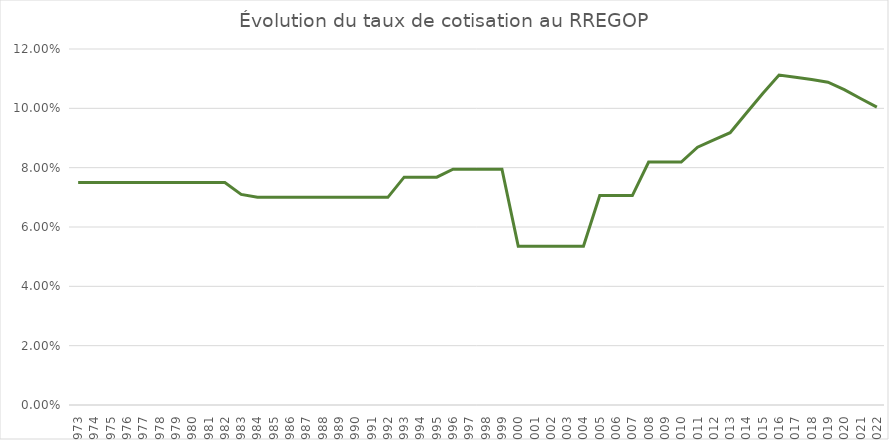
| Category | Series 0 |
|---|---|
| 1973.0 | 0.075 |
| 1974.0 | 0.075 |
| 1975.0 | 0.075 |
| 1976.0 | 0.075 |
| 1977.0 | 0.075 |
| 1978.0 | 0.075 |
| 1979.0 | 0.075 |
| 1980.0 | 0.075 |
| 1981.0 | 0.075 |
| 1982.0 | 0.075 |
| 1983.0 | 0.071 |
| 1984.0 | 0.07 |
| 1985.0 | 0.07 |
| 1986.0 | 0.07 |
| 1987.0 | 0.07 |
| 1988.0 | 0.07 |
| 1989.0 | 0.07 |
| 1990.0 | 0.07 |
| 1991.0 | 0.07 |
| 1992.0 | 0.07 |
| 1993.0 | 0.077 |
| 1994.0 | 0.077 |
| 1995.0 | 0.077 |
| 1996.0 | 0.08 |
| 1997.0 | 0.08 |
| 1998.0 | 0.08 |
| 1999.0 | 0.08 |
| 2000.0 | 0.054 |
| 2001.0 | 0.054 |
| 2002.0 | 0.054 |
| 2003.0 | 0.054 |
| 2004.0 | 0.054 |
| 2005.0 | 0.071 |
| 2006.0 | 0.071 |
| 2007.0 | 0.071 |
| 2008.0 | 0.082 |
| 2009.0 | 0.082 |
| 2010.0 | 0.082 |
| 2011.0 | 0.087 |
| 2012.0 | 0.089 |
| 2013.0 | 0.092 |
| 2014.0 | 0.098 |
| 2015.0 | 0.105 |
| 2016.0 | 0.111 |
| 2017.0 | 0.11 |
| 2018.0 | 0.11 |
| 2019.0 | 0.109 |
| 2020.0 | 0.106 |
| 2021.0 | 0.103 |
| 2022.0 | 0.1 |